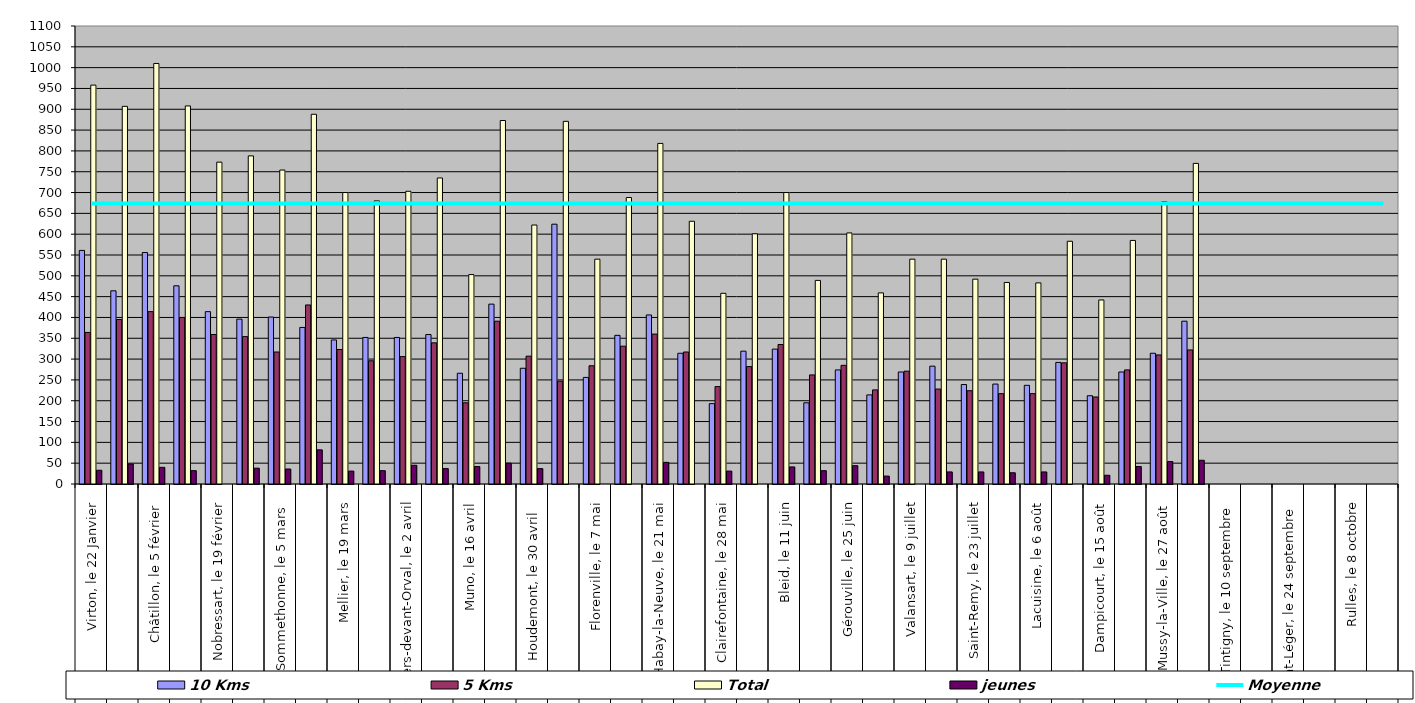
| Category | 10 Kms | 5 Kms | Total | jeunes |
|---|---|---|---|---|
| 0 | 561 | 364 | 958 | 33 |
| 1 | 464 | 395 | 907 | 48 |
| 2 | 556 | 414 | 1010 | 40 |
| 3 | 476 | 400 | 908 | 32 |
| 4 | 414 | 359 | 773 | 0 |
| 5 | 396 | 354 | 788 | 38 |
| 6 | 401 | 317 | 754 | 36 |
| 7 | 376 | 430 | 888 | 82 |
| 8 | 346 | 323 | 700 | 31 |
| 9 | 352 | 296 | 680 | 32 |
| 10 | 352 | 306 | 703 | 45 |
| 11 | 359 | 339 | 735 | 37 |
| 12 | 266 | 195 | 503 | 42 |
| 13 | 432 | 391 | 873 | 50 |
| 14 | 278 | 307 | 622 | 37 |
| 15 | 624 | 247 | 871 | 0 |
| 16 | 256 | 284 | 540 | 0 |
| 17 | 357 | 331 | 688 | 0 |
| 18 | 406 | 360 | 818 | 52 |
| 19 | 314 | 317 | 631 | 0 |
| 20 | 193 | 234 | 458 | 31 |
| 21 | 319 | 282 | 601 | 0 |
| 22 | 324 | 335 | 700 | 41 |
| 23 | 195 | 262 | 489 | 32 |
| 24 | 274 | 285 | 603 | 44 |
| 25 | 214 | 226 | 459 | 19 |
| 26 | 269 | 271 | 540 | 0 |
| 27 | 283 | 228 | 540 | 29 |
| 28 | 239 | 224 | 492 | 29 |
| 29 | 240 | 217 | 484 | 27 |
| 30 | 237 | 217 | 483 | 29 |
| 31 | 292 | 291 | 583 | 0 |
| 32 | 212 | 209 | 442 | 21 |
| 33 | 269 | 274 | 585 | 42 |
| 34 | 314 | 310 | 678 | 54 |
| 35 | 391 | 322 | 770 | 57 |
| 36 | 0 | 0 | 0 | 0 |
| 37 | 0 | 0 | 0 | 0 |
| 38 | 0 | 0 | 0 | 0 |
| 39 | 0 | 0 | 0 | 0 |
| 40 | 0 | 0 | 0 | 0 |
| 41 | 0 | 0 | 0 | 0 |